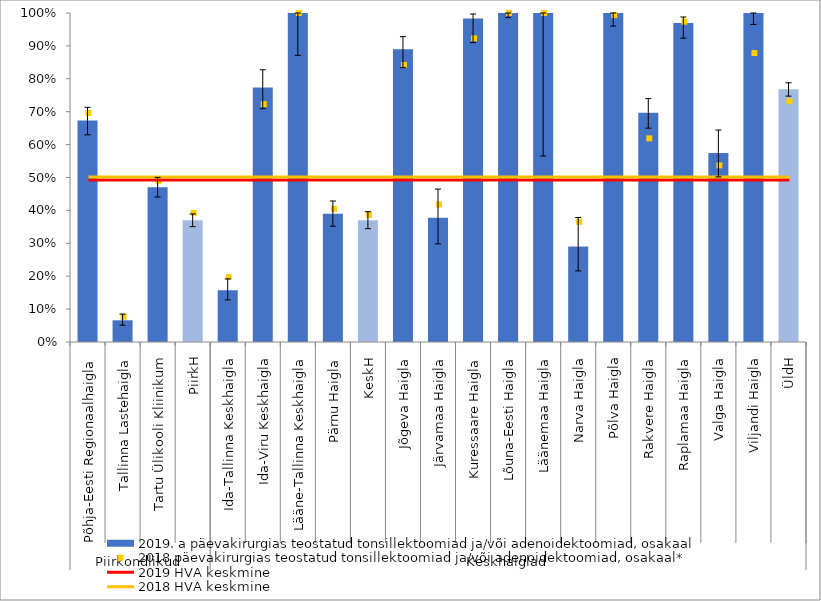
| Category | 2019. a päevakirurgias teostatud tonsillektoomiad ja/või adenoidektoomiad, osakaal |
|---|---|
| 0 | 0.673 |
| 1 | 0.066 |
| 2 | 0.471 |
| 3 | 0.37 |
| 4 | 0.157 |
| 5 | 0.774 |
| 6 | 1 |
| 7 | 0.39 |
| 8 | 0.37 |
| 9 | 0.89 |
| 10 | 0.378 |
| 11 | 0.983 |
| 12 | 1 |
| 13 | 1 |
| 14 | 0.291 |
| 15 | 1 |
| 16 | 0.697 |
| 17 | 0.969 |
| 18 | 0.575 |
| 19 | 1 |
| 20 | 0.768 |